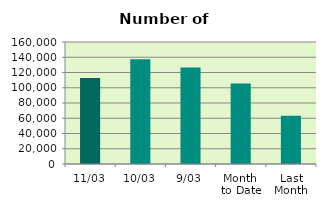
| Category | Series 0 |
|---|---|
| 11/03 | 112878 |
| 10/03 | 137500 |
| 9/03 | 126558 |
| Month 
to Date | 105450.25 |
| Last
Month | 63353.4 |